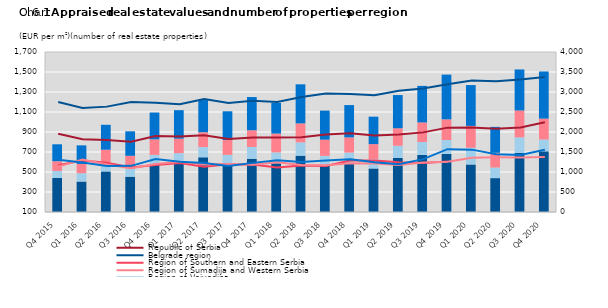
| Category | Series 5 | Series 6 | Series 7 | Series 8 |
|---|---|---|---|---|
| Q4 2015 | 850 | 177 | 243 | 423 |
| Q1 2016 | 762 | 208 | 232 | 464 |
| Q2 2016 | 1014 | 233 | 310 | 623 |
| Q3 2016 | 883 | 207 | 315 | 612 |
| Q4 2016 | 1173 | 255 | 388 | 671 |
| Q1 2017 | 1208 | 263 | 362 | 713 |
| Q2 2017 | 1368 | 255 | 371 | 804 |
| Q3 2017 | 1179 | 249 | 371 | 719 |
| Q4 2017 | 1330 | 296 | 418 | 830 |
| Q1 2018 | 1219 | 271 | 470 | 767 |
| Q2 2018 | 1409 | 332 | 474 | 977 |
| Q3 2018 | 1150 | 253 | 405 | 727 |
| Q4 2018 | 1219 | 267 | 379 | 808 |
| Q1 2019 | 1089 | 230 | 378 | 686 |
| Q2 2019 | 1350 | 305 | 438 | 831 |
| Q3 2019 | 1426 | 324 | 489 | 914 |
| Q4 2019 | 1451 | 348 | 517 | 1119 |
| Q1 2020 | 1188 | 419 | 545 | 1021 |
| Q2 2020 | 847 | 264 | 369 | 648 |
| Q3 2020 | 1476 | 390 | 672 | 1025 |
| Q4 2020 | 1517 | 295 | 522 | 1179 |